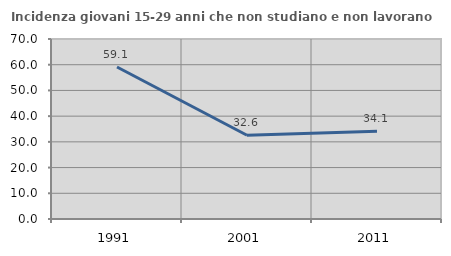
| Category | Incidenza giovani 15-29 anni che non studiano e non lavorano  |
|---|---|
| 1991.0 | 59.104 |
| 2001.0 | 32.553 |
| 2011.0 | 34.123 |